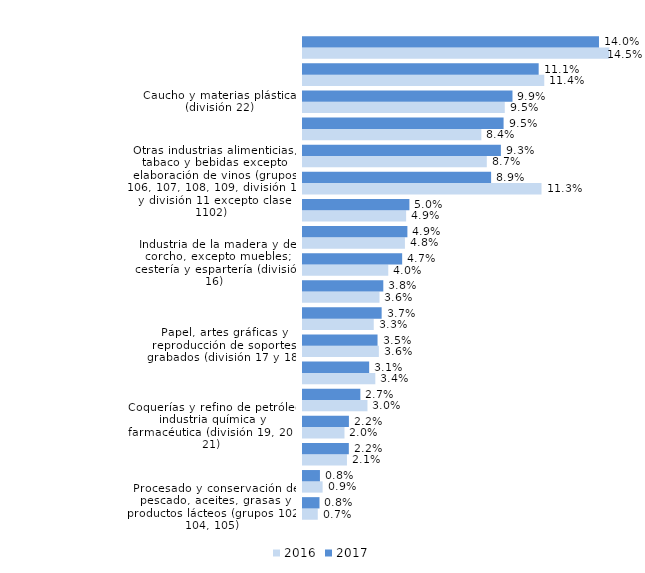
| Category | 2016 | 2017 |
|---|---|---|
| Procesado y conservación de pescado, aceites, grasas y productos lácteos (grupos 102, 104, 105) | 0.007 | 0.008 |
| Fabricación de productos informáticos, eléctricos, electrónicos y ópticos (división 26 y 27) | 0.009 | 0.008 |
| Otras industrias manufactureras y reparación e instalación de maquinaria y equipo (división 32 y 33) | 0.021 | 0.022 |
| Coquerías y refino de petróleo, industria química y farmacéutica (división 19, 20 y 21) | 0.02 | 0.022 |
| Industria textil, confección y cuero (divisiones 13,14 y 15 excepto grupo 152)  | 0.03 | 0.027 |
| Productos minerales no metálicos diversos (división 23) | 0.034 | 0.031 |
| Papel, artes gráficas y reproducción de soportes grabados (división 17 y 18) | 0.036 | 0.035 |
| Metalurgia, metales para la construcción, calderas, depósitos contenedores, armas y municiones (división 24 y grupos 251, 252, 253 y 254) | 0.033 | 0.037 |
| Procesado y conservación de productos cárnicos (grupo 101) | 0.036 | 0.038 |
| Industria de la madera y del corcho, excepto muebles; cestería y espartería (división 16) | 0.04 | 0.047 |
| Fabricación de muebles (división 31) | 0.048 | 0.049 |
| Procesado y conservación de frutas y hortalizas (grupo 103) | 0.049 | 0.05 |
| Otras industrias alimenticias, tabaco y bebidas excepto elaboración de vinos (grupos 106, 107, 108, 109, división 12 y división 11 excepto clase 1102) | 0.113 | 0.089 |
| Forja, estampación, embutición, revestimiento y fabricación de otros productos metálicos (grupos 255, 256, 257, 259) | 0.087 | 0.093 |
| Fabricación de maquinaria, equipo y material de transporte (división 28, 29 y 30) | 0.084 | 0.095 |
| Caucho y materias plásticas (división 22) | 0.095 | 0.099 |
| Elaboración de vinos (clase 1102) | 0.114 | 0.111 |
| Fabricación de calzado (grupo 152) | 0.145 | 0.14 |